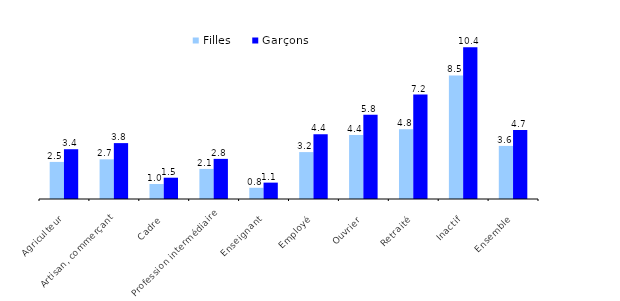
| Category | Filles | Garçons |
|---|---|---|
| Agriculteur | 2.542 | 3.413 |
| Artisan, commerçant | 2.719 | 3.832 |
| Cadre | 1.03 | 1.46 |
| Profession intermédiaire | 2.063 | 2.751 |
| Enseignant | 0.768 | 1.123 |
| Employé | 3.216 | 4.437 |
| Ouvrier | 4.393 | 5.782 |
| Retraité | 4.788 | 7.16 |
| Inactif | 8.471 | 10.413 |
| Ensemble | 3.64 | 4.736 |